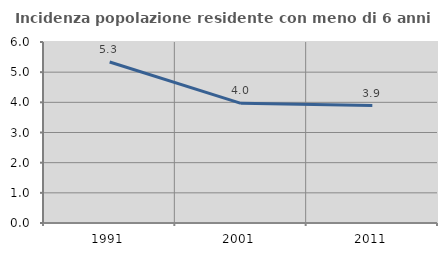
| Category | Incidenza popolazione residente con meno di 6 anni |
|---|---|
| 1991.0 | 5.336 |
| 2001.0 | 3.966 |
| 2011.0 | 3.891 |